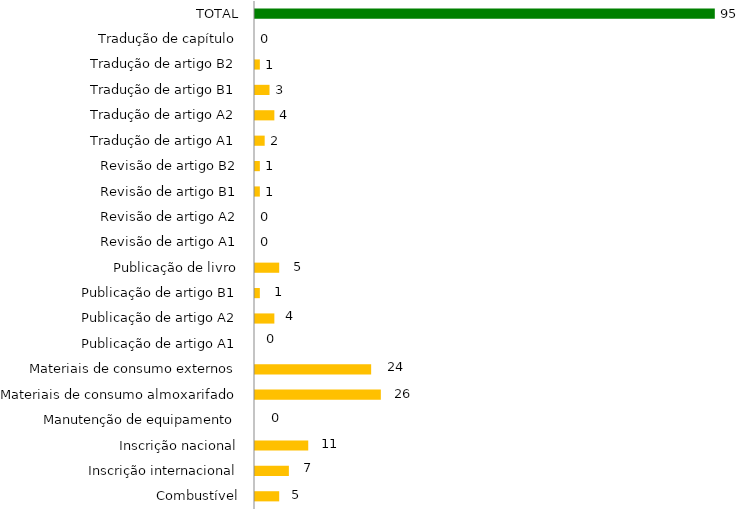
| Category | Series 1 |
|---|---|
| Combustível | 5 |
| Inscrição internacional | 7 |
| Inscrição nacional | 11 |
| Manutenção de equipamento | 0 |
| Materiais de consumo almoxarifado | 26 |
| Materiais de consumo externos | 24 |
| Publicação de artigo A1 | 0 |
| Publicação de artigo A2 | 4 |
| Publicação de artigo B1 | 1 |
| Publicação de livro | 5 |
| Revisão de artigo A1 | 0 |
| Revisão de artigo A2 | 0 |
| Revisão de artigo B1 | 1 |
| Revisão de artigo B2 | 1 |
| Tradução de artigo A1 | 2 |
| Tradução de artigo A2 | 4 |
| Tradução de artigo B1 | 3 |
| Tradução de artigo B2 | 1 |
| Tradução de capítulo | 0 |
| TOTAL | 95 |